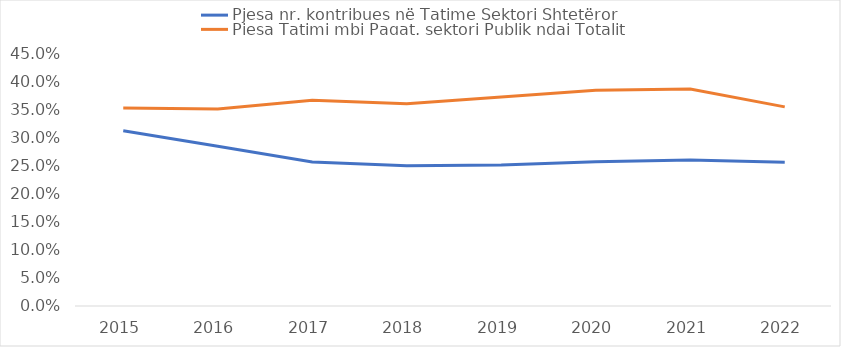
| Category | Pjesa nr. kontribues në Tatime Sektori Shtetëror | Pjesa Tatimi mbi Pagat, sektori Publik ndaj Totalit |
|---|---|---|
| 2015.0 | 0.313 | 0.353 |
| 2016.0 | 0.285 | 0.352 |
| 2017.0 | 0.257 | 0.368 |
| 2018.0 | 0.25 | 0.361 |
| 2019.0 | 0.252 | 0.373 |
| 2020.0 | 0.258 | 0.385 |
| 2021.0 | 0.261 | 0.387 |
| 2022.0 | 0.257 | 0.356 |